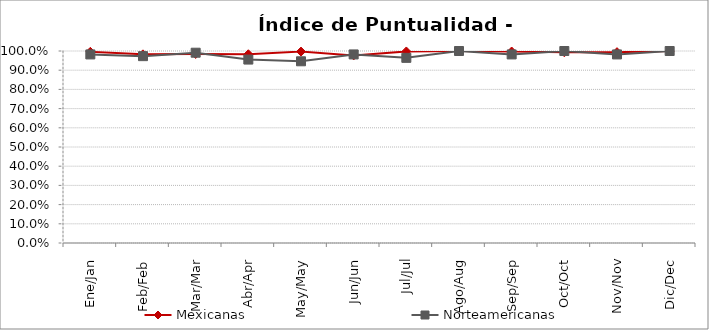
| Category | Mexicanas | Norteamericanas |
|---|---|---|
| Ene/Jan | 0.996 | 0.982 |
| Feb/Feb | 0.983 | 0.973 |
| Mar/Mar | 0.985 | 0.991 |
| Abr/Apr | 0.983 | 0.955 |
| May/May | 0.997 | 0.946 |
| Jun/Jun | 0.977 | 0.982 |
| Jul/Jul | 0.998 | 0.964 |
| Ago/Aug | 1 | 1 |
| Sep/Sep | 0.997 | 0.982 |
| Oct/Oct | 0.993 | 1 |
| Nov/Nov | 0.994 | 0.982 |
| Dic/Dec | 0.999 | 1 |